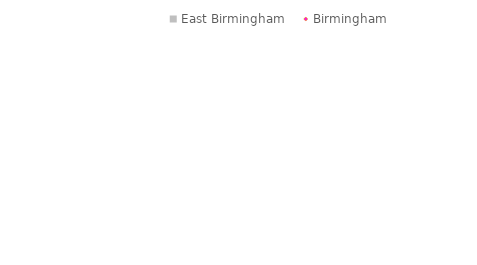
| Category | East Birmingham |
|---|---|
| Lone pensioner | -10.728 |
| Other lone householder | -1.715 |
| Pensioner only (excluding lone pensioners) | -13.415 |
| Lone parents with dependent children | -3.473 |
| One family only with dependent children (excluding lone parents) | 5.87 |
| One family only with non-dependent children | 22.257 |
| One family only with no children | -3.053 |
| Other households with dependent children | 11.752 |
| Other households including All student and all pensioner | 4.281 |